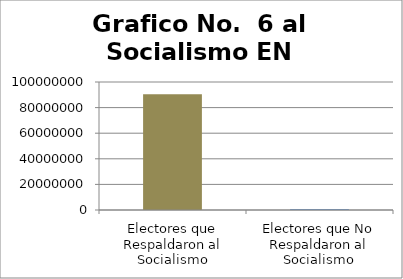
| Category | RESPALDO AL SOCIALISMO EN URSS |
|---|---|
| Electores que Respaldaron al Socialismo | 90368000 |
| Electores que No Respaldaron al Socialismo | 632000 |